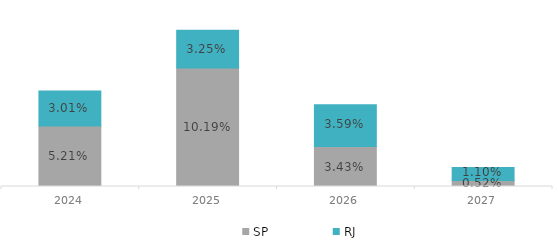
| Category | SP | RJ |
|---|---|---|
| 2024 | 0.052 | 0.03 |
| 2025 | 0.102 | 0.033 |
| 2026 | 0.034 | 0.036 |
| 2027 | 0.005 | 0.011 |